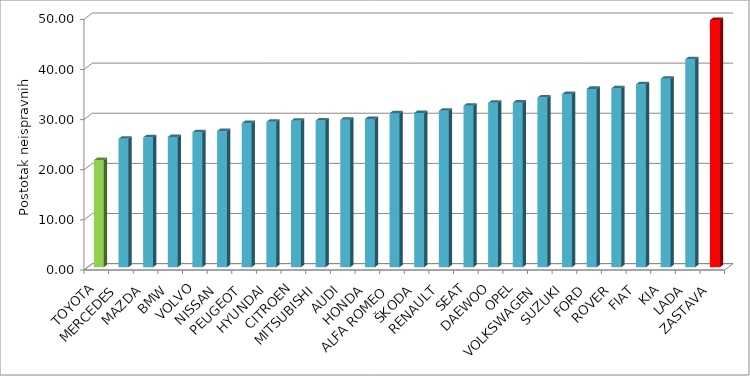
| Category | Series 4 |
|---|---|
| TOYOTA | 21.371 |
| MERCEDES | 25.644 |
| MAZDA | 25.917 |
| BMW | 25.999 |
| VOLVO | 26.934 |
| NISSAN | 27.156 |
| PEUGEOT | 28.751 |
| HYUNDAI | 29.008 |
| CITROEN | 29.225 |
| MITSUBISHI | 29.284 |
| AUDI | 29.432 |
| HONDA | 29.595 |
| ALFA ROMEO | 30.721 |
| ŠKODA | 30.79 |
| RENAULT | 31.218 |
| SEAT | 32.236 |
| DAEWOO | 32.804 |
| OPEL | 32.844 |
| VOLKSWAGEN | 33.87 |
| SUZUKI | 34.577 |
| FORD | 35.59 |
| ROVER | 35.688 |
| FIAT | 36.506 |
| KIA | 37.619 |
| LADA | 41.511 |
| ZASTAVA | 49.308 |